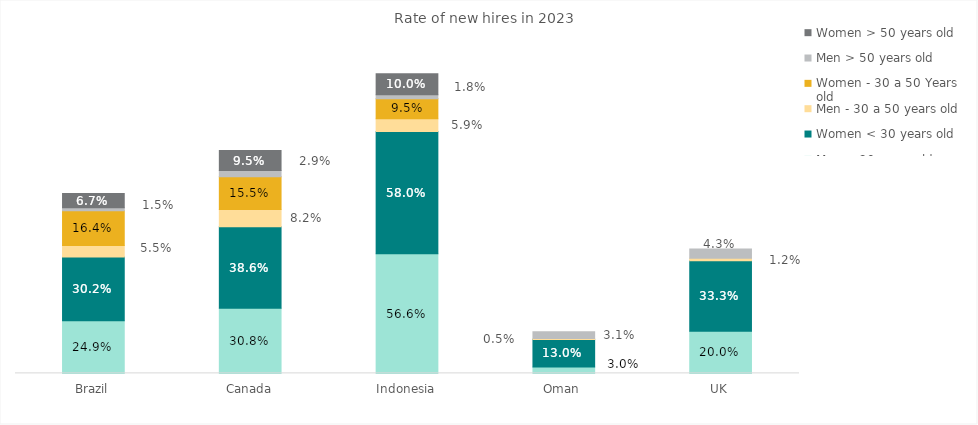
| Category | Men < 30 years old | Women < 30 years old | Men - 30 a 50 years old | Women - 30 a 50 Years old | Men > 50 years old | Women > 50 years old |
|---|---|---|---|---|---|---|
| Brazil | 0.249 | 0.302 | 0.055 | 0.164 | 0.015 | 0.067 |
| Canada | 0.308 | 0.386 | 0.082 | 0.155 | 0.029 | 0.095 |
| Indonesia | 0.566 | 0.58 | 0.059 | 0.095 | 0.018 | 0.1 |
| Oman | 0.03 | 0.13 | 0.005 | 0 | 0.031 | 0 |
| UK | 0.2 | 0.333 | 0.012 | 0 | 0.043 | 0 |